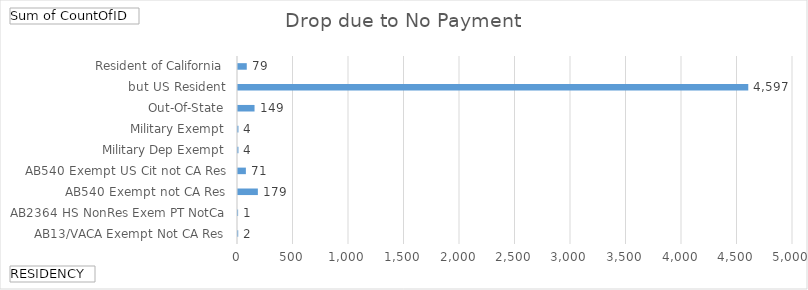
| Category | Total |
|---|---|
| AB13/VACA Exempt Not CA Res | 2 |
| AB2364 HS NonRes Exem PT NotCa | 1 |
| AB540 Exempt not CA Res | 179 |
| AB540 Exempt US Cit not CA Res | 71 |
| Military Dep Exempt | 4 |
| Military Exempt | 4 |
| Out-Of-State, but US Resident | 149 |
| Resident of California | 4597 |
| Resident of Foreign Country | 79 |